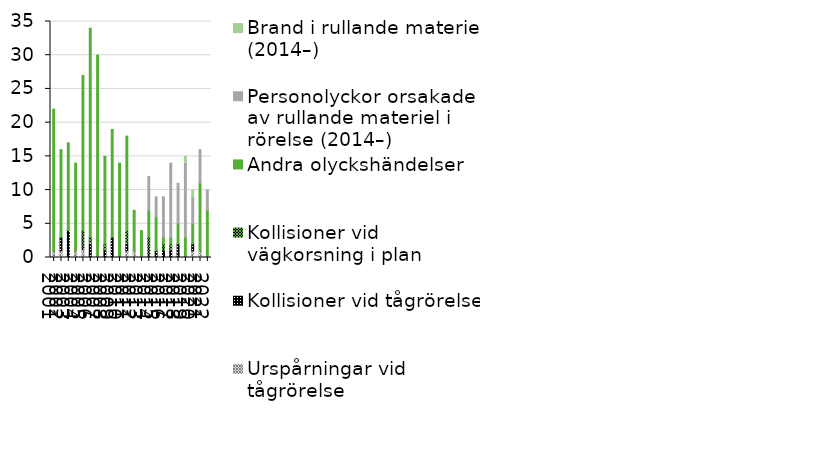
| Category | Urspårningar vid tågrörelse  | Kollisioner vid tågrörelse | Kollisioner vid vägkorsning i plan | Andra olyckshändelser | Personolyckor orsakade av rullande materiel i rörelse (2014–) | Brand i rullande materiel (2014–) |
|---|---|---|---|---|---|---|
| 2001 | 1 | 0 | 0 | 21 | 0 | 0 |
| 2002 | 1 | 2 | 0 | 13 | 0 | 0 |
| 2003 | 0 | 4 | 0 | 13 | 0 | 0 |
| 2004 | 1 | 0 | 0 | 13 | 0 | 0 |
| 2005 | 1 | 0 | 3 | 23 | 0 | 0 |
| 2006 | 0 | 2 | 1 | 31 | 0 | 0 |
| 2007 | 0 | 0 | 0 | 30 | 0 | 0 |
| 2008 | 0 | 1 | 1 | 13 | 0 | 0 |
| 2009 | 0 | 3 | 0 | 16 | 0 | 0 |
| 2010 | 0 | 0 | 0 | 14 | 0 | 0 |
| 2011 | 1 | 1 | 2 | 14 | 0 | 0 |
| 2012 | 1 | 0 | 0 | 6 | 0 | 0 |
| 2013 | 0 | 0 | 0 | 4 | 0 | 0 |
| 2014 | 0 | 0 | 3 | 4 | 5 | 0 |
| 2015 | 0 | 1 | 0 | 5 | 3 | 0 |
| 2016 | 0 | 1 | 1 | 1 | 6 | 0 |
| 2017 | 0 | 1 | 1 | 1 | 11 | 0 |
| 2018 | 0 | 2 | 0 | 3 | 6 | 0 |
| 2019 | 0 | 0 | 0 | 3 | 11 | 1 |
| 2020 | 1 | 1 | 0 | 3 | 4 | 1 |
| 2021 | 1 | 0 | 0 | 10 | 5 | 0 |
| 2022 | 0 | 0 | 0 | 7 | 3 | 0 |